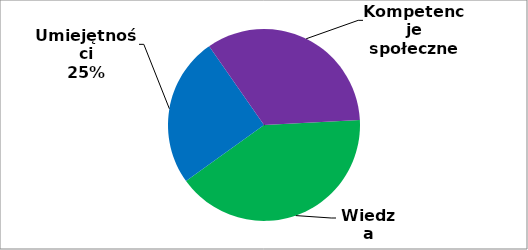
| Category | Series 0 |
|---|---|
| 0 | 133 |
| 1 | 82 |
| 2 | 110 |